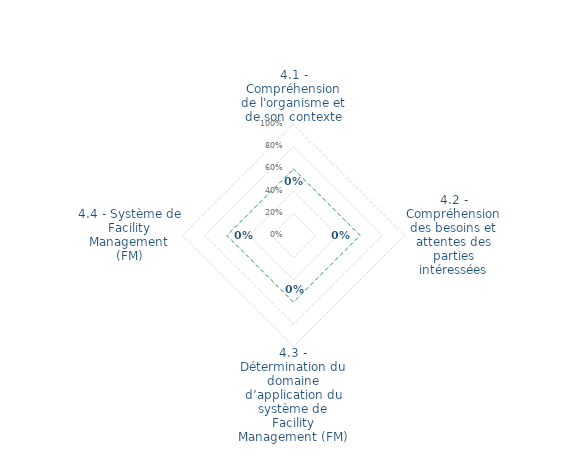
| Category | Art. 4 | limite de CONFORMITÉ |
|---|---|---|
| 4.1 - Compréhension de l'organisme et de son contexte | 0 | 0.6 |
| 4.2 - Compréhension des besoins et attentes des parties intéressées | 0 | 0.6 |
| 4.3 - Détermination du domaine d’application du système de Facility Management (FM) | 0 | 0.6 |
| 4.4 - Système de Facility Management (FM) | 0 | 0.6 |